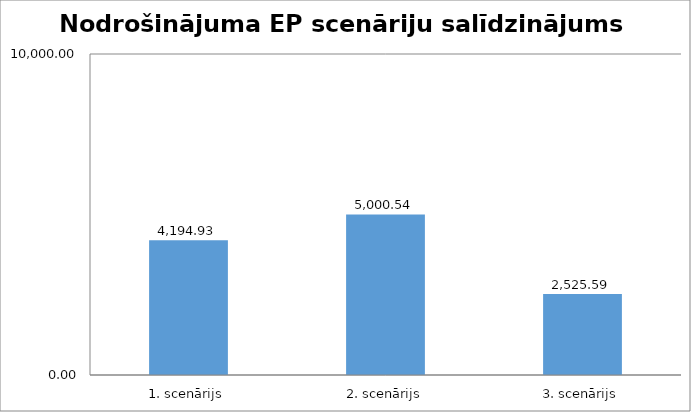
| Category | Series 0 |
|---|---|
| 1. scenārijs | 4194.927 |
| 2. scenārijs | 5000.538 |
| 3. scenārijs | 2525.591 |